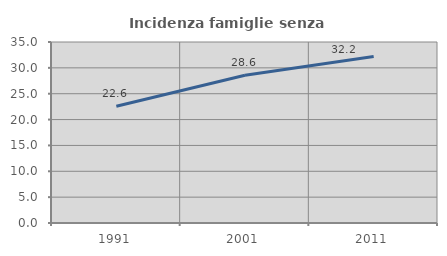
| Category | Incidenza famiglie senza nuclei |
|---|---|
| 1991.0 | 22.574 |
| 2001.0 | 28.584 |
| 2011.0 | 32.203 |